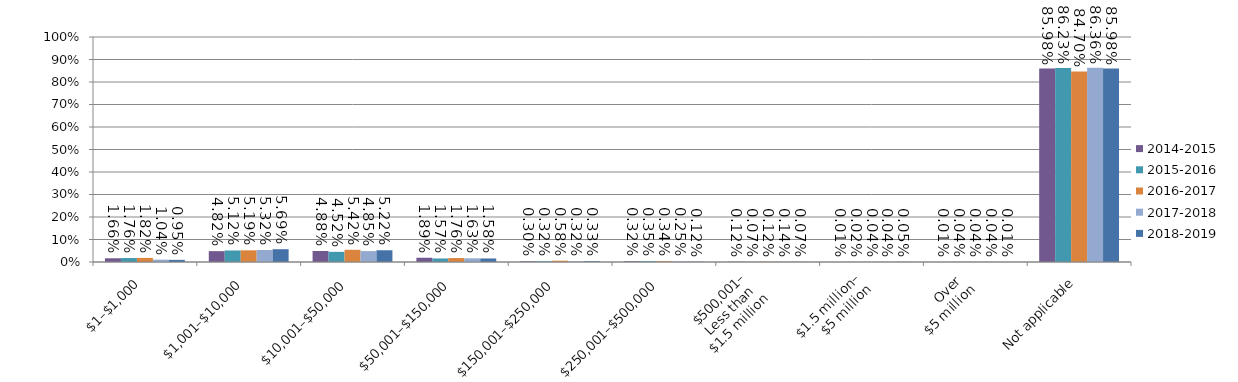
| Category | 2014-2015 | 2015-2016 | 2016-2017 | 2017-2018 | 2018-2019 |
|---|---|---|---|---|---|
| $1–$1,000 | 0.017 | 0.018 | 0.018 | 0.01 | 0.009 |
| $1,001–$10,000 | 0.048 | 0.051 | 0.052 | 0.053 | 0.057 |
| $10,001–$50,000 | 0.049 | 0.045 | 0.054 | 0.048 | 0.052 |
| $50,001–$150,000 | 0.019 | 0.016 | 0.018 | 0.016 | 0.016 |
| $150,001–$250,000 | 0.003 | 0.003 | 0.006 | 0.003 | 0.003 |
| $250,001–$500,000 | 0.003 | 0.003 | 0.003 | 0.003 | 0.001 |
| $500,001–
Less than 
$1.5 million | 0.001 | 0.001 | 0.001 | 0.001 | 0.001 |
| $1.5 million–
$5 million | 0 | 0 | 0 | 0 | 0.001 |
| Over 
$5 million | 0 | 0 | 0 | 0 | 0 |
| Not applicable | 0.86 | 0.862 | 0.847 | 0.864 | 0.86 |